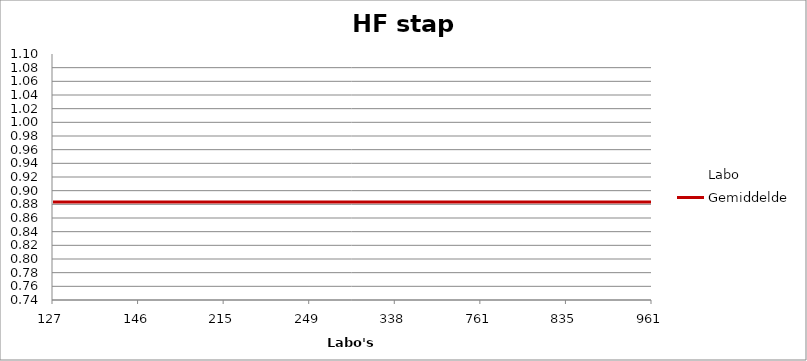
| Category | Labo | Gemiddelde |
|---|---|---|
| 127.0 | 0.75 | 0.883 |
| 146.0 | 0.9 | 0.883 |
| 215.0 | 1.008 | 0.883 |
| 249.0 | 0.653 | 0.883 |
| 338.0 | 0.911 | 0.883 |
| 761.0 | 0.953 | 0.883 |
| 835.0 | 0.863 | 0.883 |
| 961.0 | 0.988 | 0.883 |